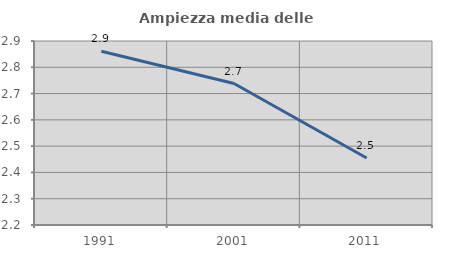
| Category | Ampiezza media delle famiglie |
|---|---|
| 1991.0 | 2.861 |
| 2001.0 | 2.738 |
| 2011.0 | 2.455 |